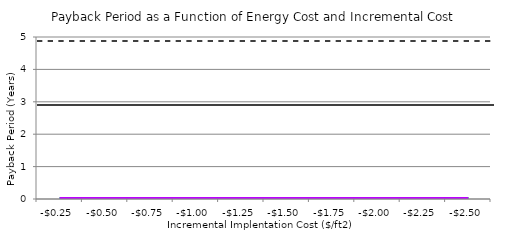
| Category | Series 0 | Series 1 | Series 2 |
|---|---|---|---|
| -0.25 | 0 | 0 | 0 |
| -0.5 | 0 | 0 | 0 |
| -0.75 | 0 | 0 | 0 |
| -1.0 | 0 | 0 | 0 |
| -1.25 | 0 | 0 | 0 |
| -1.5 | 0 | 0 | 0 |
| -1.75 | 0 | 0 | 0 |
| -2.0 | 0 | 0 | 0 |
| -2.25 | 0 | 0 | 0 |
| -2.5 | 0 | 0 | 0 |